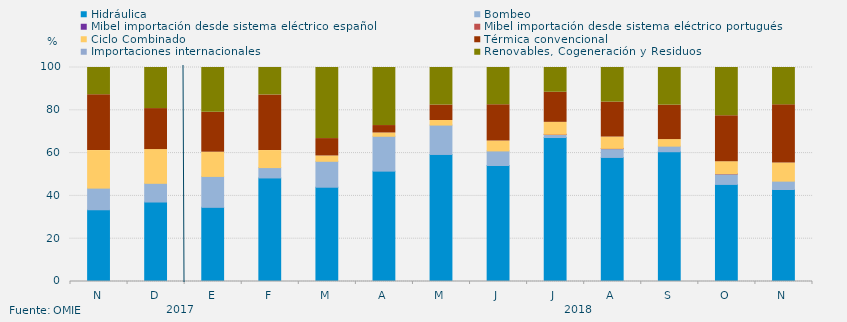
| Category | Hidráulica | Bombeo | Mibel importación desde sistema eléctrico español | Mibel importación desde sistema eléctrico portugués | Ciclo Combinado | Térmica convencional | Importaciones internacionales | Renovables, Cogeneración y Residuos |
|---|---|---|---|---|---|---|---|---|
| N | 33.519 | 10.116 | 0 | 0 | 17.546 | 26.088 | 0 | 12.731 |
| D | 37.142 | 8.737 | 0 | 0 | 15.771 | 19.153 | 0 | 19.198 |
| E | 34.655 | 14.449 | 0 | 0 | 11.313 | 18.638 | 0 | 20.945 |
| F | 48.388 | 4.836 | 0 | 0 | 7.961 | 25.992 | 0 | 12.822 |
| M | 44.056 | 12.113 | 0 | 0 | 2.49 | 8.12 | 0 | 33.221 |
| A | 51.574 | 16.296 | 0 | 0 | 1.528 | 3.472 | 0 | 27.13 |
| M | 59.364 | 13.732 | 0 | 0 | 2.128 | 7.236 | 0 | 17.54 |
| J | 54.213 | 6.806 | 0 | 0 | 4.63 | 16.944 | 0 | 17.407 |
| J | 67.272 | 1.411 | 0 | 0.134 | 5.556 | 14.068 | 0 | 11.559 |
| A | 57.975 | 4.099 | 0 | 0.134 | 5.287 | 16.331 | 0 | 16.174 |
| S | 60.637 | 2.616 | 0 | 0 | 3.067 | 16.1 | 0 | 17.581 |
| O | 45.363 | 4.906 | 0 | 0.134 | 5.578 | 21.438 | 0 | 22.581 |
| N | 42.998 | 3.9 | 0 | 0 | 8.472 | 27.187 | 0 | 17.442 |